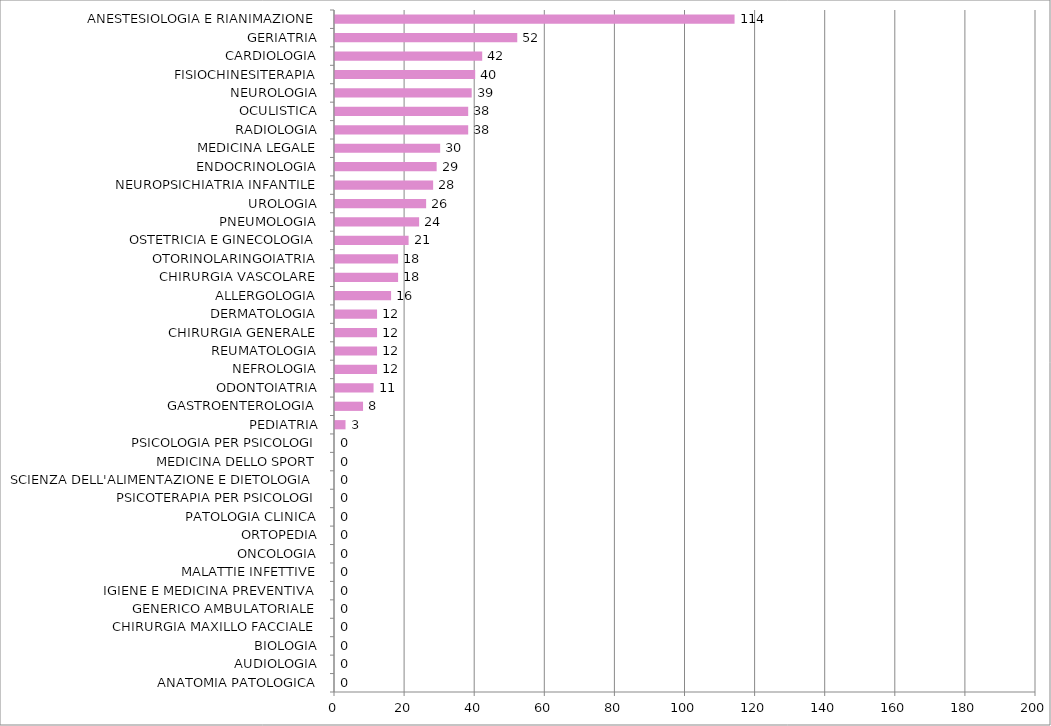
| Category | Series 0 |
|---|---|
| ANATOMIA PATOLOGICA | 0 |
| AUDIOLOGIA | 0 |
| BIOLOGIA | 0 |
| CHIRURGIA MAXILLO FACCIALE | 0 |
| GENERICO AMBULATORIALE | 0 |
| IGIENE E MEDICINA PREVENTIVA | 0 |
| MALATTIE INFETTIVE | 0 |
| ONCOLOGIA | 0 |
| ORTOPEDIA | 0 |
| PATOLOGIA CLINICA | 0 |
| PSICOTERAPIA PER PSICOLOGI | 0 |
| SCIENZA DELL'ALIMENTAZIONE E DIETOLOGIA | 0 |
| MEDICINA DELLO SPORT | 0 |
| PSICOLOGIA PER PSICOLOGI | 0 |
| PEDIATRIA | 3 |
| GASTROENTEROLOGIA | 8 |
| ODONTOIATRIA | 11 |
| NEFROLOGIA | 12 |
| REUMATOLOGIA | 12 |
| CHIRURGIA GENERALE | 12 |
| DERMATOLOGIA | 12 |
| ALLERGOLOGIA | 16 |
| CHIRURGIA VASCOLARE | 18 |
| OTORINOLARINGOIATRIA | 18 |
| OSTETRICIA E GINECOLOGIA | 21 |
| PNEUMOLOGIA | 24 |
| UROLOGIA | 26 |
| NEUROPSICHIATRIA INFANTILE | 28 |
| ENDOCRINOLOGIA | 29 |
| MEDICINA LEGALE | 30 |
| RADIOLOGIA | 38 |
| OCULISTICA | 38 |
| NEUROLOGIA | 39 |
| FISIOCHINESITERAPIA | 40 |
| CARDIOLOGIA | 42 |
| GERIATRIA | 52 |
| ANESTESIOLOGIA E RIANIMAZIONE | 114 |